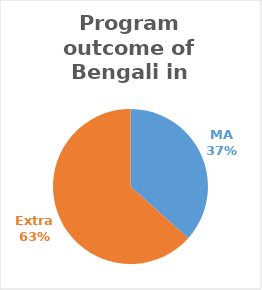
| Category | Series 0 |
|---|---|
| MA | 26 |
| Extra | 45 |